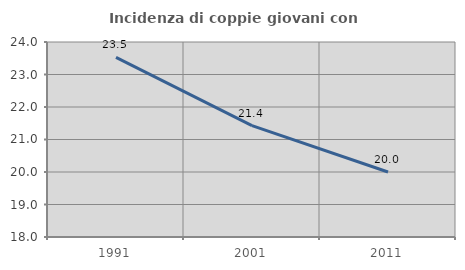
| Category | Incidenza di coppie giovani con figli |
|---|---|
| 1991.0 | 23.529 |
| 2001.0 | 21.429 |
| 2011.0 | 20 |